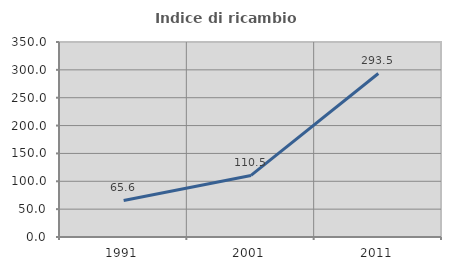
| Category | Indice di ricambio occupazionale  |
|---|---|
| 1991.0 | 65.58 |
| 2001.0 | 110.502 |
| 2011.0 | 293.496 |